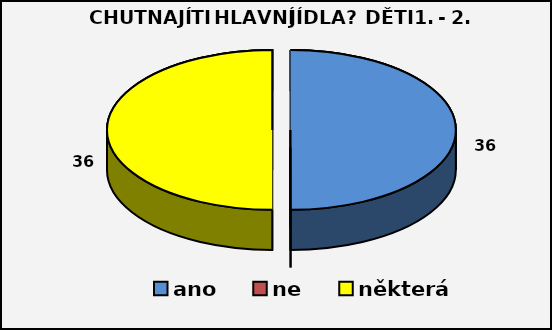
| Category | Series 0 |
|---|---|
| ano | 36 |
| ne | 0 |
| některá | 36 |